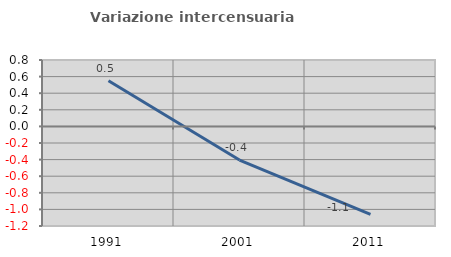
| Category | Variazione intercensuaria annua |
|---|---|
| 1991.0 | 0.55 |
| 2001.0 | -0.406 |
| 2011.0 | -1.061 |